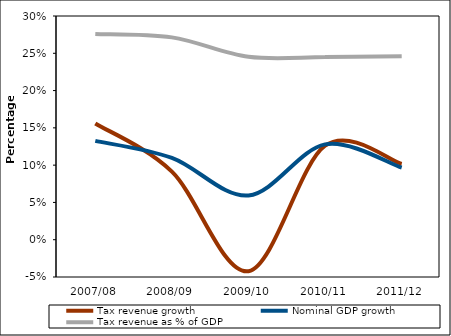
| Category | Tax revenue growth | Nominal GDP growth | Tax revenue as % of GDP |
|---|---|---|---|
| 2007/08 | 0.156 | 0.133 | 0.276 |
| 2008/09 | 0.091 | 0.11 | 0.271 |
| 2009/10 | -0.042 | 0.059 | 0.245 |
| 2010/11 | 0.126 | 0.128 | 0.245 |
| 2011/12 | 0.102 | 0.097 | 0.246 |